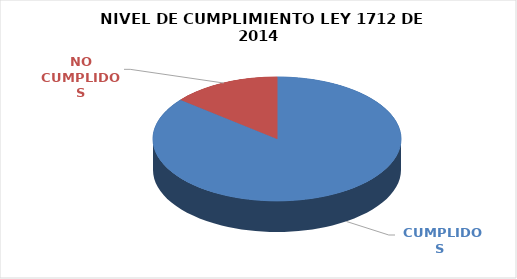
| Category | Series 0 |
|---|---|
|  CUMPLIDOS | 97 |
| NO CUMPLIDOS | 16 |